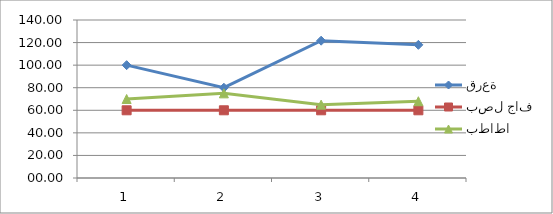
| Category | قرعة | بصل جاف | بطاطا |
|---|---|---|---|
| 0 | 100 | 60 | 70 |
| 1 | 80 | 60 | 75 |
| 2 | 121.67 | 60 | 65 |
| 3 | 118 | 60 | 68 |